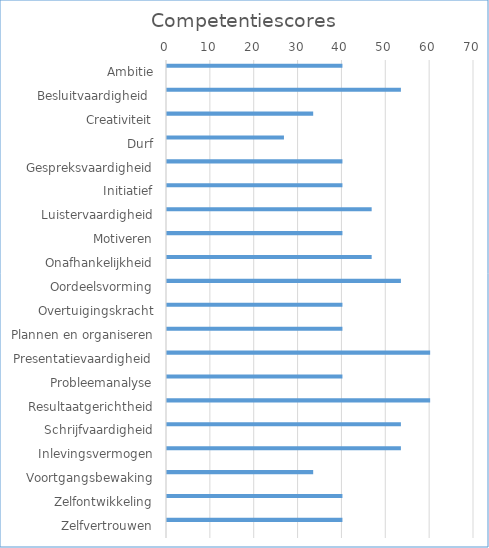
| Category | Series 0 | Series 1 | Series 2 | Series 3 |
|---|---|---|---|---|
| Ambitie | 40 | 0 | 0 | 0 |
| Besluitvaardigheid  | 53.333 | 0 | 0 | 0 |
| Creativiteit | 33.333 | 0 | 0 | 0 |
| Durf | 26.667 | 0 | 0 | 0 |
| Gespreksvaardigheid | 40 | 0 | 0 | 0 |
| Initiatief | 40 | 0 | 0 | 0 |
| Luistervaardigheid | 46.667 | 0 | 0 | 0 |
| Motiveren | 40 | 0 | 0 | 0 |
| Onafhankelijkheid | 46.667 | 0 | 0 | 0 |
| Oordeelsvorming | 53.333 | 0 | 0 | 0 |
| Overtuigingskracht | 40 | 0 | 0 | 0 |
| Plannen en organiseren | 40 | 0 | 0 | 0 |
| Presentatievaardigheid | 60 | 0 | 0 | 0 |
| Probleemanalyse | 40 | 0 | 0 | 0 |
| Resultaatgerichtheid | 60 | 0 | 0 | 0 |
| Schrijfvaardigheid | 53.333 | 0 | 0 | 0 |
| Inlevingsvermogen | 53.333 | 0 | 0 | 0 |
| Voortgangsbewaking | 33.333 | 0 | 0 | 0 |
| Zelfontwikkeling | 40 | 0 | 0 | 0 |
| Zelfvertrouwen | 40 | 0 | 0 | 0 |